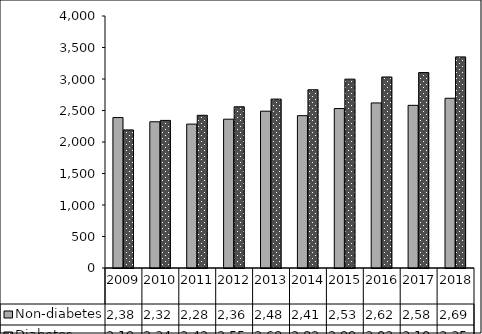
| Category | Non-diabetes | Diabetes |
|---|---|---|
| 2009.0 | 2388 | 2192 |
| 2010.0 | 2321 | 2343 |
| 2011.0 | 2284 | 2424 |
| 2012.0 | 2362 | 2559 |
| 2013.0 | 2489 | 2681 |
| 2014.0 | 2418 | 2829 |
| 2015.0 | 2531 | 2998 |
| 2016.0 | 2620 | 3032 |
| 2017.0 | 2582 | 3102 |
| 2018.0 | 2694 | 3351 |